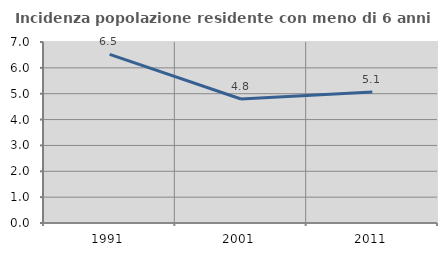
| Category | Incidenza popolazione residente con meno di 6 anni |
|---|---|
| 1991.0 | 6.52 |
| 2001.0 | 4.796 |
| 2011.0 | 5.07 |